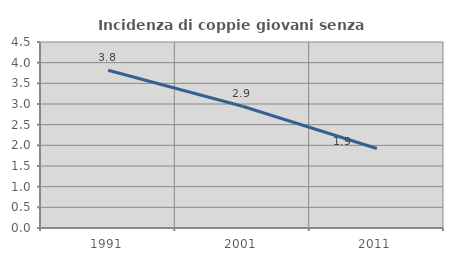
| Category | Incidenza di coppie giovani senza figli |
|---|---|
| 1991.0 | 3.816 |
| 2001.0 | 2.946 |
| 2011.0 | 1.925 |